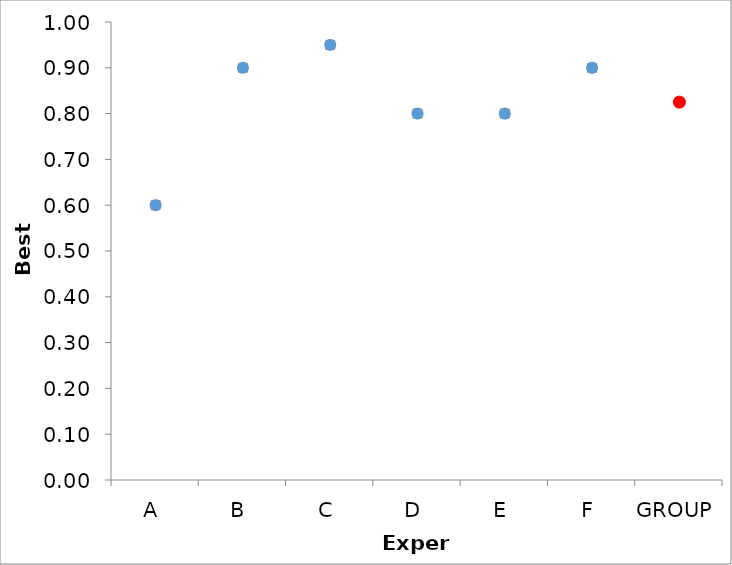
| Category | Series 1 | Series 0 |
|---|---|---|
| A | 0.6 | 0.6 |
| B | 0.9 | 0.9 |
| C | 0.95 | 0.95 |
| D | 0.8 | 0.8 |
| E | 0.8 | 0.8 |
| F | 0.9 | 0.9 |
| GROUP | 0.825 | 0.825 |